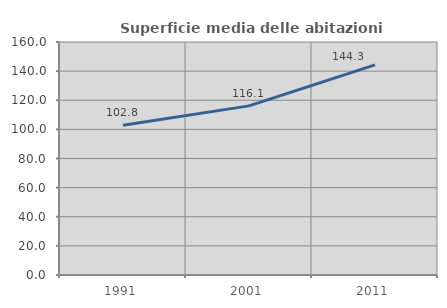
| Category | Superficie media delle abitazioni occupate |
|---|---|
| 1991.0 | 102.766 |
| 2001.0 | 116.147 |
| 2011.0 | 144.327 |